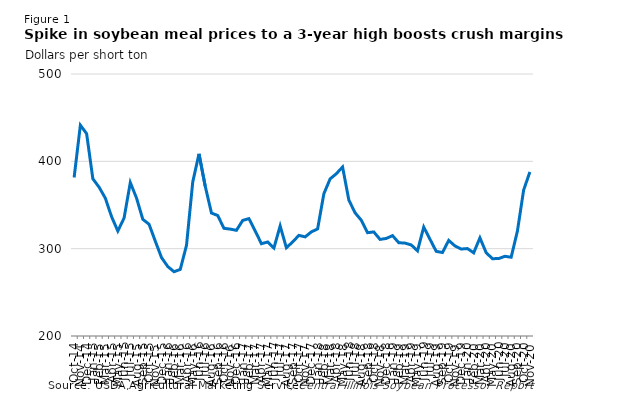
| Category | Series 1 |
|---|---|
| 2014-10-01 | 381.5 |
| 2014-11-01 | 441.39 |
| 2014-12-01 | 431.73 |
| 2015-01-01 | 380.03 |
| 2015-02-01 | 370.38 |
| 2015-03-01 | 357.83 |
| 2015-04-01 | 336.61 |
| 2015-05-01 | 320.23 |
| 2015-06-01 | 335.03 |
| 2015-07-01 | 375.71 |
| 2015-08-01 | 357.85 |
| 2015-09-01 | 333.62 |
| 2015-10-01 | 327.97 |
| 2015-11-01 | 308.6 |
| 2015-12-01 | 289.78 |
| 2016-01-01 | 279.56 |
| 2016-02-01 | 273.61 |
| 2016-03-01 | 276.22 |
| 2016-04-01 | 303.81 |
| 2016-05-01 | 376.35 |
| 2016-06-01 | 408.57 |
| 2016-07-01 | 371.49 |
| 2016-08-01 | 340.8 |
| 2016-09-01 | 337.95 |
| 2016-10-01 | 323.27 |
| 2016-11-01 | 322.41 |
| 2016-12-01 | 321.02 |
| 2017-01-01 | 332.34 |
| 2017-02-01 | 334.42 |
| 2017-03-01 | 320.34 |
| 2017-04-01 | 305.67 |
| 2017-05-01 | 307.63 |
| 2017-06-01 | 300.72 |
| 2017-07-01 | 326.04 |
| 2017-08-01 | 301.05 |
| 2017-09-01 | 307.7 |
| 2017-10-01 | 315.23 |
| 2017-11-01 | 313.52 |
| 2017-12-01 | 319.22 |
| 2018-01-01 | 322.6 |
| 2018-02-01 | 362.85 |
| 2018-03-01 | 379.85 |
| 2018-04-01 | 385.84 |
| 2018-05-01 | 393.55 |
| 2018-06-01 | 355.71 |
| 2018-07-01 | 341.08 |
| 2018-08-01 | 332.5 |
| 2018-09-01 | 318.32 |
| 2018-10-01 | 319.15 |
| 2018-11-01 | 310.62 |
| 2018-12-01 | 311.7 |
| 2019-01-01 | 314.92 |
| 2019-02-01 | 306.83 |
| 2019-03-01 | 306.38 |
| 2019-04-01 | 304.26 |
| 2019-05-01 | 297.52 |
| 2019-06-01 | 324.75 |
| 2019-07-01 | 310.77 |
| 2019-08-01 | 296.92 |
| 2019-09-01 | 295.57 |
| 2019-10-01 | 309.48 |
| 2019-11-01 | 303.13 |
| 2019-12-01 | 299.59 |
| 2020-01-01 | 300.11 |
| 2020-02-01 | 295.28 |
| 2020-03-01 | 312.38 |
| 2020-04-01 | 295.4 |
| 2020-05-01 | 288.56 |
| 2020-06-01 | 288.66 |
| 2020-07-01 | 291.25 |
| 2020-08-01 | 290.18 |
| 2020-09-01 | 319.99 |
| 2020-10-01 | 367.11 |
| 2020-11-01 | 387.83 |